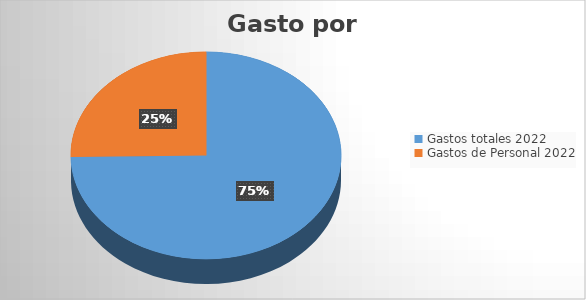
| Category | Series 0 |
|---|---|
| Gastos totales 2022 | 1479.348 |
| Gastos de Personal 2022 | 499.998 |